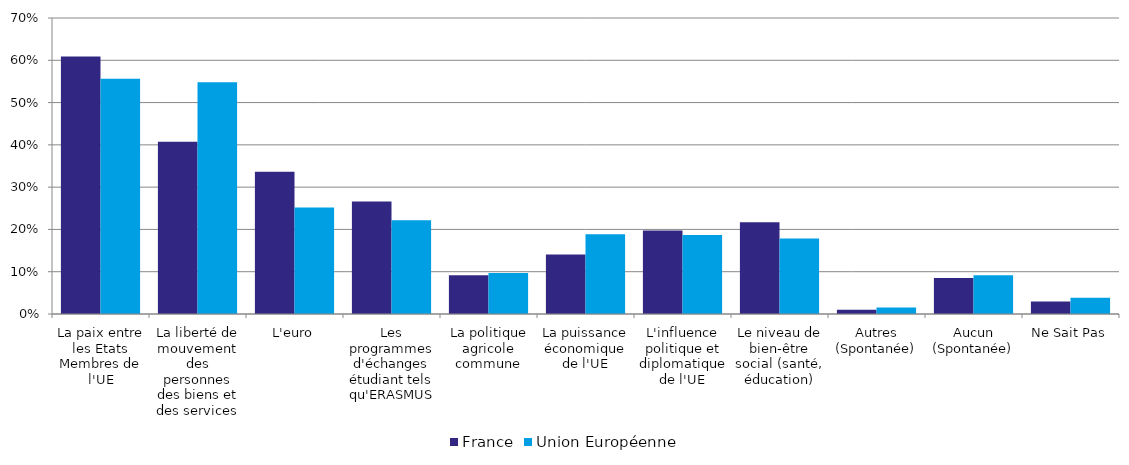
| Category | France | Union Européenne |
|---|---|---|
| La paix entre les Etats Membres de l'UE | 0.609 | 0.556 |
| La liberté de mouvement des personnes des biens et des services | 0.408 | 0.548 |
| L'euro | 0.336 | 0.252 |
| Les programmes d'échanges étudiant tels qu'ERASMUS | 0.266 | 0.222 |
| La politique agricole commune | 0.091 | 0.097 |
| La puissance économique de l'UE | 0.141 | 0.189 |
| L'influence politique et diplomatique de l'UE | 0.197 | 0.187 |
| Le niveau de bien-être social (santé, éducation) | 0.217 | 0.178 |
| Autres (Spontanée) | 0.01 | 0.015 |
| Aucun (Spontanée) | 0.085 | 0.091 |
| Ne Sait Pas | 0.03 | 0.038 |